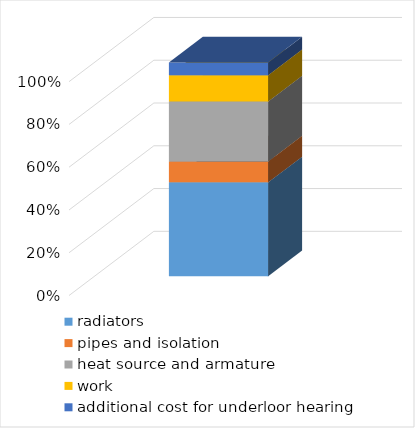
| Category | radiators | pipes and isolation | heat source and armature | work | additional cost for underloor hearing |
|---|---|---|---|---|---|
| inne | 3239.75 | 722 | 2070 | 904.762 | 440 |